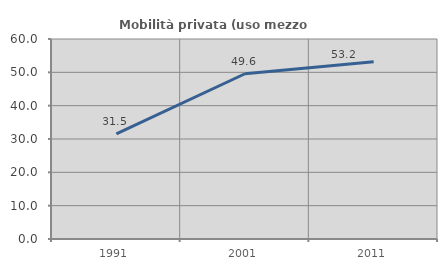
| Category | Mobilità privata (uso mezzo privato) |
|---|---|
| 1991.0 | 31.532 |
| 2001.0 | 49.577 |
| 2011.0 | 53.198 |